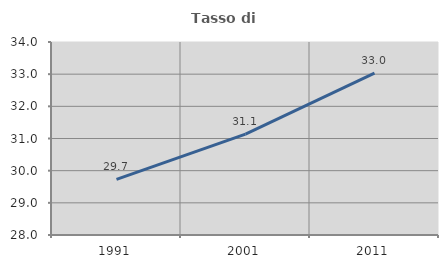
| Category | Tasso di occupazione   |
|---|---|
| 1991.0 | 29.731 |
| 2001.0 | 31.137 |
| 2011.0 | 33.033 |